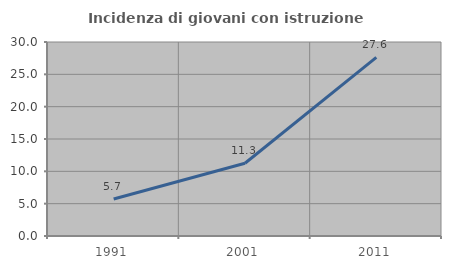
| Category | Incidenza di giovani con istruzione universitaria |
|---|---|
| 1991.0 | 5.714 |
| 2001.0 | 11.251 |
| 2011.0 | 27.614 |